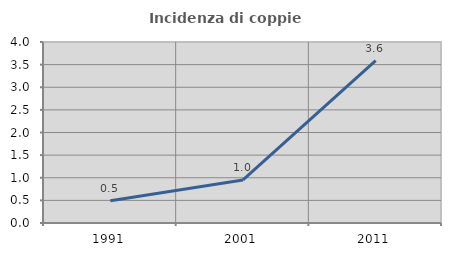
| Category | Incidenza di coppie miste |
|---|---|
| 1991.0 | 0.493 |
| 2001.0 | 0.952 |
| 2011.0 | 3.587 |